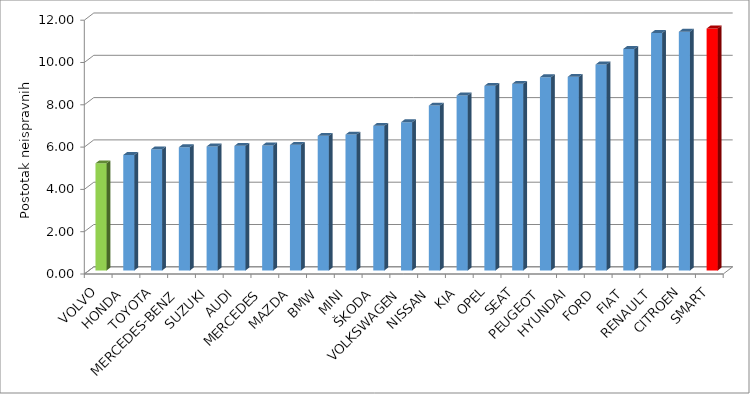
| Category | Series 4 |
|---|---|
| VOLVO | 5.066 |
| HONDA | 5.46 |
| TOYOTA | 5.727 |
| MERCEDES-BENZ | 5.827 |
| SUZUKI | 5.862 |
| AUDI | 5.891 |
| MERCEDES | 5.908 |
| MAZDA | 5.937 |
| BMW | 6.365 |
| MINI | 6.426 |
| ŠKODA | 6.839 |
| VOLKSWAGEN | 7.009 |
| NISSAN | 7.794 |
| KIA | 8.275 |
| OPEL | 8.729 |
| SEAT | 8.825 |
| PEUGEOT | 9.138 |
| HYUNDAI | 9.155 |
| FORD | 9.737 |
| FIAT | 10.472 |
| RENAULT | 11.227 |
| CITROEN | 11.285 |
| SMART | 11.439 |